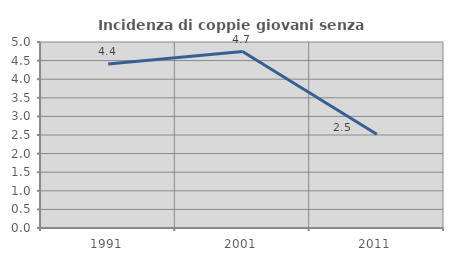
| Category | Incidenza di coppie giovani senza figli |
|---|---|
| 1991.0 | 4.412 |
| 2001.0 | 4.743 |
| 2011.0 | 2.519 |